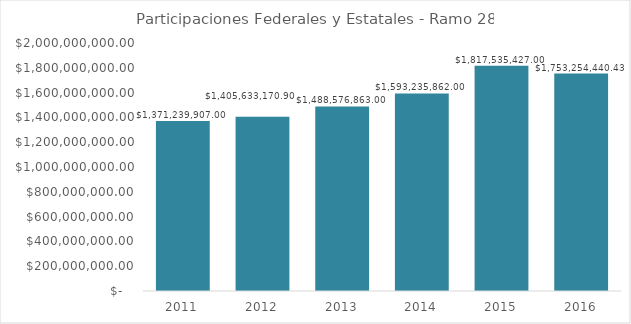
| Category | Participaciones Federales y Estatales - Ramo 28 |
|---|---|
| 2011.0 | 1371239907 |
| 2012.0 | 1405633170.9 |
| 2013.0 | 1488576863 |
| 2014.0 | 1593235862 |
| 2015.0 | 1817535427 |
| 2016.0 | 1753254440.43 |